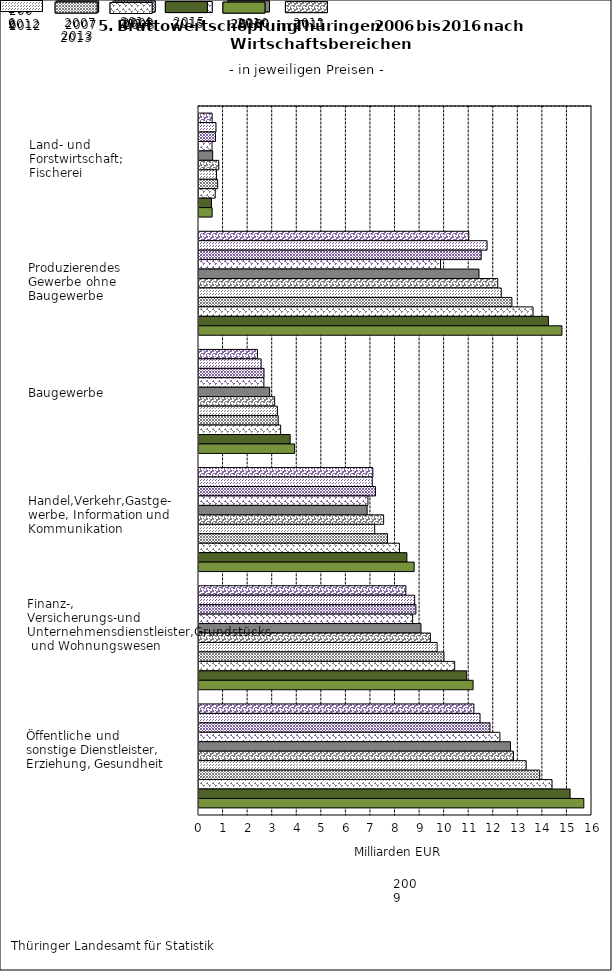
| Category | Series 0 | Series 1 | Series 2 | Series 3 | Series 4 | Series 5 | Series 6 | Series 7 | Series 8 | Series 9 | Series 10 |
|---|---|---|---|---|---|---|---|---|---|---|---|
| Land-und Forstwirtschaft; Fischerei | 0.535 | 0.692 | 0.67 | 0.531 | 0.556 | 0.804 | 0.711 | 0.761 | 0.66 | 0.509 | 0.535 |
| Produzierendes Gewerbe ohne Baugewerbe | 10.985 | 11.728 | 11.487 | 9.833 | 11.398 | 12.162 | 12.307 | 12.737 | 13.601 | 14.225 | 14.776 |
| Baugewerbe | 2.379 | 2.529 | 2.646 | 2.642 | 2.878 | 3.079 | 3.192 | 3.224 | 3.323 | 3.711 | 3.893 |
| Handel, Verkehr, Gastgewerbe, Information und Kommunikation | 7.077 | 7.054 | 7.185 | 6.878 | 6.844 | 7.517 | 7.153 | 7.675 | 8.16 | 8.464 | 8.76 |
| Finanz-, Versicherungs- und Unternehmensdienstl., Grundstücks- und Wohnungswesen | 8.422 | 8.781 | 8.83 | 8.698 | 9.037 | 9.421 | 9.695 | 9.971 | 10.41 | 10.898 | 11.159 |
| Öffentliche und sonstige Dienstleister, Erziehung, Gesundheit | 11.191 | 11.442 | 11.845 | 12.251 | 12.681 | 12.803 | 13.322 | 13.873 | 14.372 | 15.109 | 15.667 |